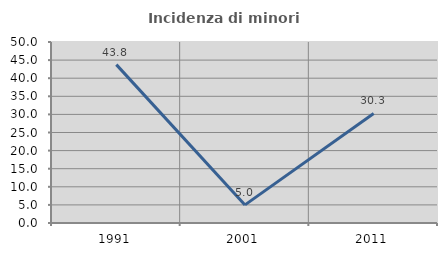
| Category | Incidenza di minori stranieri |
|---|---|
| 1991.0 | 43.75 |
| 2001.0 | 5 |
| 2011.0 | 30.252 |